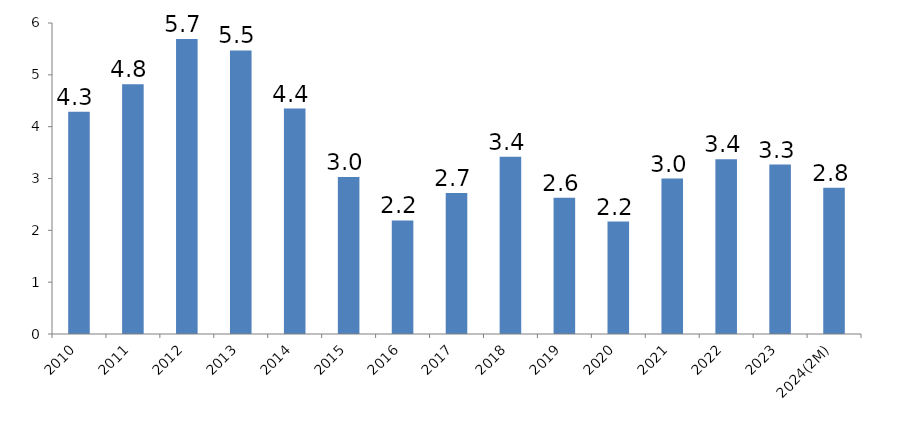
| Category | Value of Exported Energy : Total Export (%) |
|---|---|
| 2010 | 4.29 |
| 2011 | 4.82 |
| 2012 | 5.69 |
| 2013 | 5.47 |
| 2014 | 4.35 |
| 2015 | 3.03 |
| 2016 | 2.19 |
| 2017 | 2.72 |
| 2018 | 3.42 |
| 2019 | 2.63 |
| 2020 | 2.17 |
| 2021 | 3 |
| 2022 | 3.37 |
| 2023 | 3.27 |
| 2024(2M) | 2.82 |